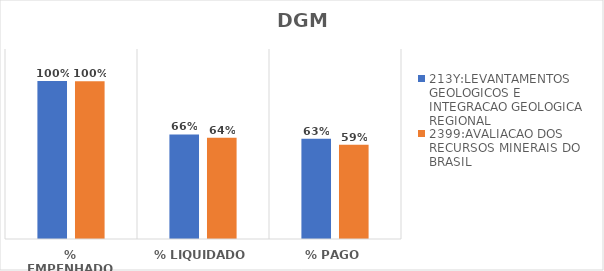
| Category | 213Y:LEVANTAMENTOS GEOLOGICOS E INTEGRACAO GEOLOGICA REGIONAL | 2399:AVALIACAO DOS RECURSOS MINERAIS DO BRASIL |
|---|---|---|
| % EMPENHADO | 0.998 | 0.996 |
| % LIQUIDADO | 0.661 | 0.639 |
| % PAGO | 0.633 | 0.595 |